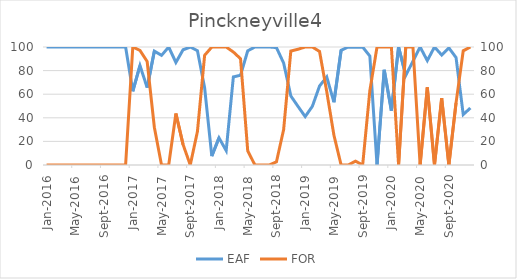
| Category | EAF |
|---|---|
| 2016-01-01 | 100 |
| 2016-02-01 | 100 |
| 2016-03-01 | 100 |
| 2016-04-01 | 100 |
| 2016-05-01 | 100 |
| 2016-06-01 | 100 |
| 2016-07-01 | 100 |
| 2016-08-01 | 100 |
| 2016-09-01 | 100 |
| 2016-10-01 | 100 |
| 2016-11-01 | 100 |
| 2016-12-01 | 100 |
| 2017-01-01 | 62.46 |
| 2017-02-01 | 84.28 |
| 2017-03-01 | 65.59 |
| 2017-04-01 | 96.42 |
| 2017-05-01 | 92.89 |
| 2017-06-01 | 100 |
| 2017-07-01 | 86.93 |
| 2017-08-01 | 97.65 |
| 2017-09-01 | 100 |
| 2017-10-01 | 96.79 |
| 2017-11-01 | 65.46 |
| 2017-12-01 | 7.54 |
| 2018-01-01 | 23.02 |
| 2018-02-01 | 12.21 |
| 2018-03-01 | 74.65 |
| 2018-04-01 | 76.07 |
| 2018-05-01 | 96.77 |
| 2018-06-01 | 100 |
| 2018-07-01 | 100 |
| 2018-08-01 | 100 |
| 2018-09-01 | 99.48 |
| 2018-10-01 | 86.38 |
| 2018-11-01 | 58.52 |
| 2018-12-01 | 49.65 |
| 2019-01-01 | 41.04 |
| 2019-02-01 | 49.76 |
| 2019-03-01 | 66.97 |
| 2019-04-01 | 74.62 |
| 2019-05-01 | 53.21 |
| 2019-06-01 | 97.2 |
| 2019-07-01 | 100 |
| 2019-08-01 | 99.7 |
| 2019-09-01 | 100 |
| 2019-10-01 | 92.36 |
| 2019-11-01 | 0 |
| 2019-12-01 | 80.67 |
| 2020-01-01 | 46.02 |
| 2020-02-01 | 100 |
| 2020-03-01 | 76 |
| 2020-04-01 | 87.92 |
| 2020-05-01 | 100 |
| 2020-06-01 | 88.47 |
| 2020-07-01 | 100 |
| 2020-08-01 | 93.24 |
| 2020-09-01 | 99.3 |
| 2020-10-01 | 91.05 |
| 2020-11-01 | 42.76 |
| 2020-12-01 | 48.3 |